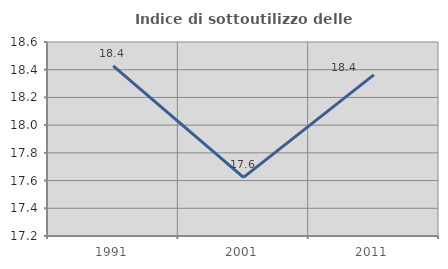
| Category | Indice di sottoutilizzo delle abitazioni  |
|---|---|
| 1991.0 | 18.428 |
| 2001.0 | 17.623 |
| 2011.0 | 18.363 |